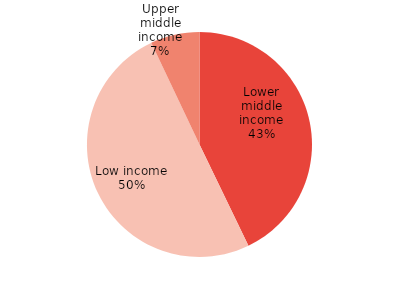
| Category | Series 0 |
|---|---|
| Lower middle income | 11315927 |
| Low income | 13237188 |
| Upper middle income | 1863570 |